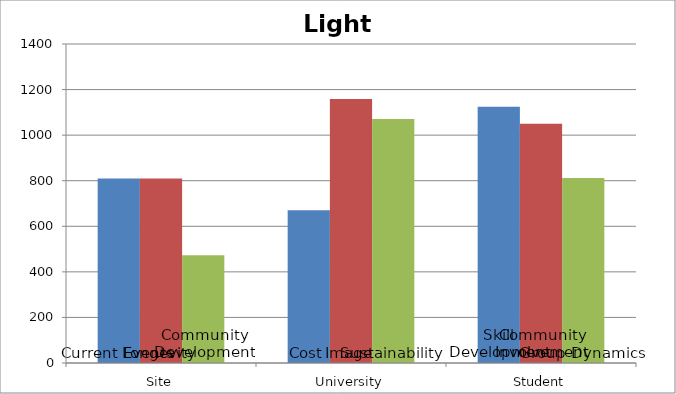
| Category | Alignment1 | Alignment2 | Alignment3 |
|---|---|---|---|
| 0 | 810 | 810 | 472.5 |
| 1 | 670 | 1158.75 | 1070.625 |
| 2 | 1125 | 1050 | 812 |